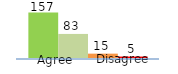
| Category | Series 0 | Series 1 | Series 2 | Series 3 |
|---|---|---|---|---|
| 0 | 157 | 83 | 15 | 5 |